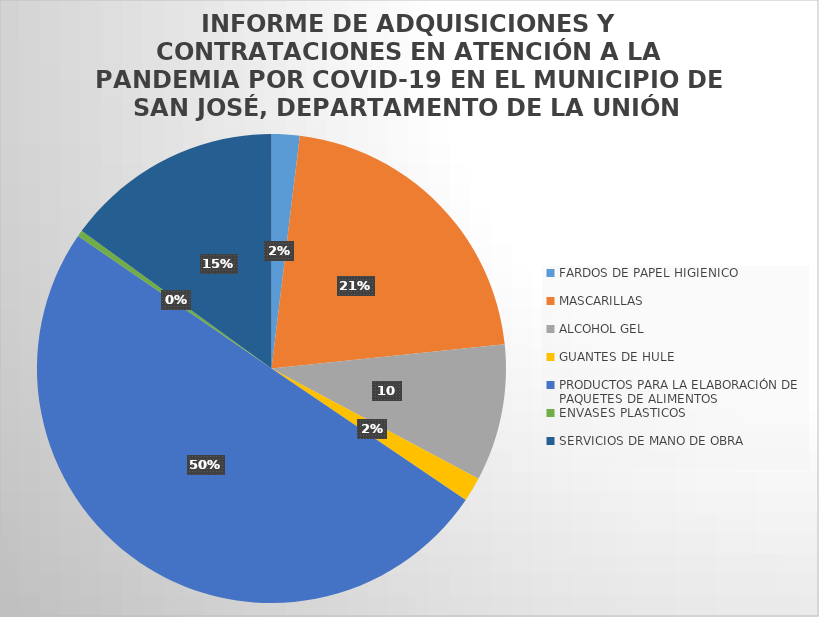
| Category | Series 0 |
|---|---|
| FARDOS DE PAPEL HIGIENICO | 205 |
| MASCARILLAS  | 2277.5 |
| ALCOHOL GEL | 1004 |
| GUANTES DE HULE | 178 |
| PRODUCTOS PARA LA ELABORACIÓN DE PAQUETES DE ALIMENTOS | 5325.02 |
| ENVASES PLASTICOS | 44.98 |
| SERVICIOS DE MANO DE OBRA | 1596 |